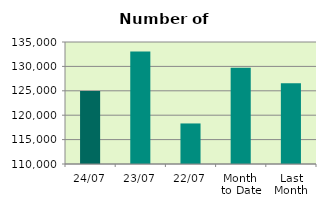
| Category | Series 0 |
|---|---|
| 24/07 | 124946 |
| 23/07 | 133074 |
| 22/07 | 118310 |
| Month 
to Date | 129716.556 |
| Last
Month | 126531 |